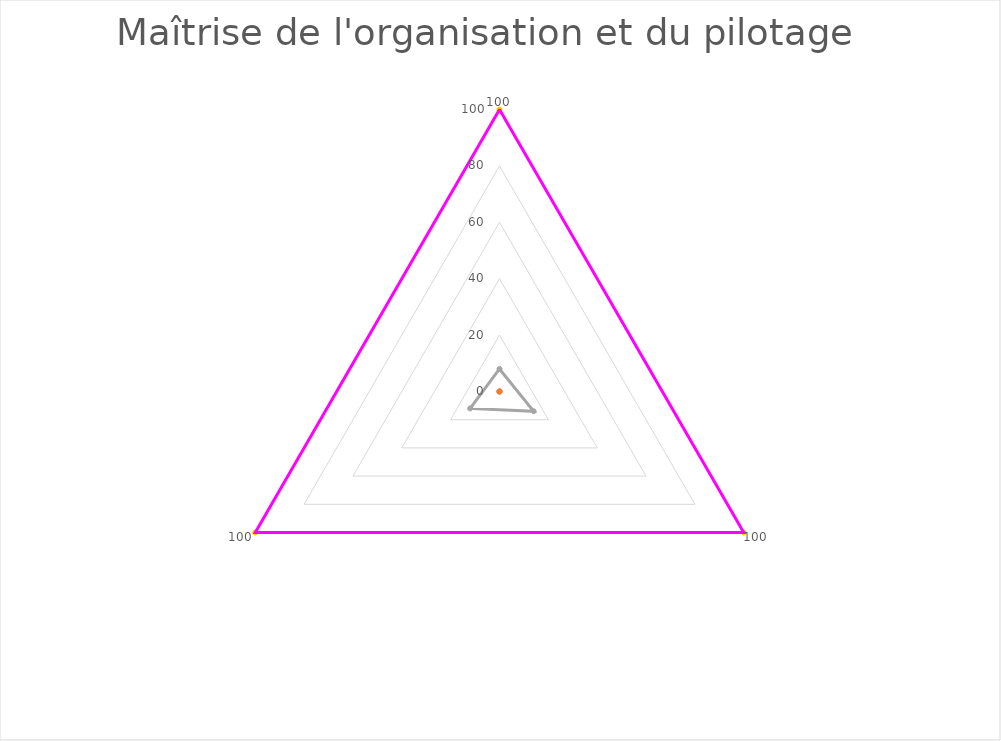
| Category | Series 1 | Series 2 | Series 3 |
|---|---|---|---|
| 0 |  | 8 | 100 |
| 1 |  | 14 | 100 |
| 2 |  | 12 | 100 |